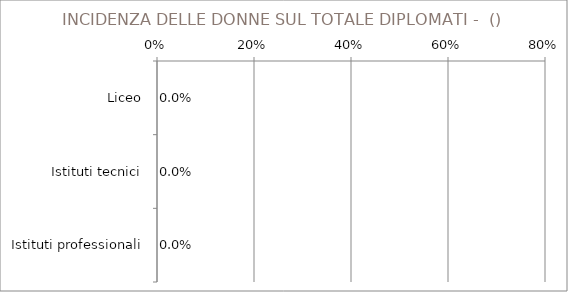
| Category | Series 0 |
|---|---|
| Liceo | 0 |
| Istituti tecnici | 0 |
| Istituti professionali | 0 |